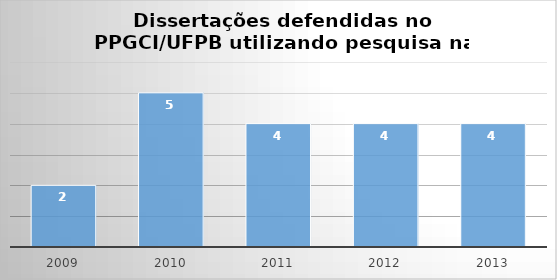
| Category | Ano da Defesa |
|---|---|
| 2009.0 | 2 |
| 2010.0 | 5 |
| 2011.0 | 4 |
| 2012.0 | 4 |
| 2013.0 | 4 |